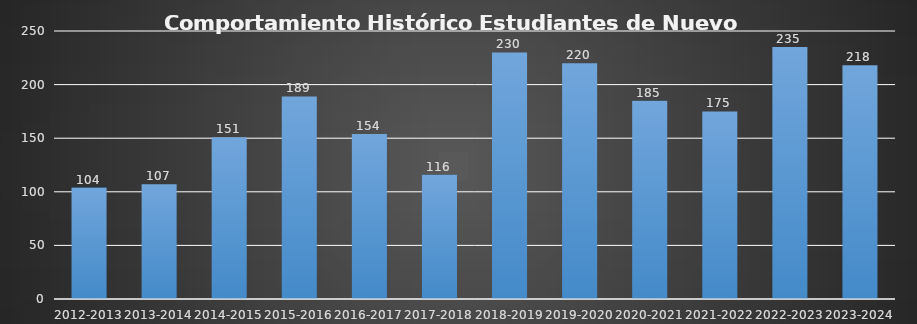
| Category | Series 0 |
|---|---|
| 2012-2013 | 104 |
| 2013-2014 | 107 |
| 2014-2015 | 151 |
| 2015-2016 | 189 |
| 2016-2017 | 154 |
| 2017-2018 | 116 |
| 2018-2019 | 230 |
| 2019-2020 | 220 |
| 2020-2021 | 185 |
| 2021-2022 | 175 |
| 2022-2023 | 235 |
| 2023-2024 | 218 |